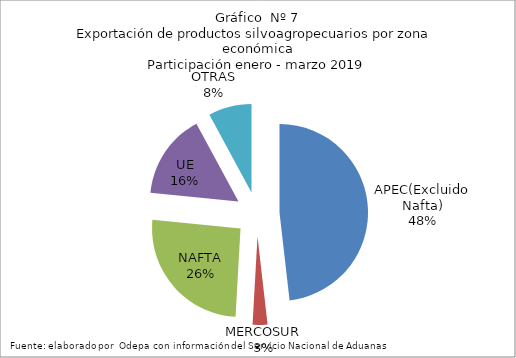
| Category | Series 0 |
|---|---|
| APEC(Excluido Nafta) | 2294049.519 |
| MERCOSUR | 129140.157 |
| NAFTA | 1222351.066 |
| UE | 740408.97 |
| OTRAS | 375523.288 |